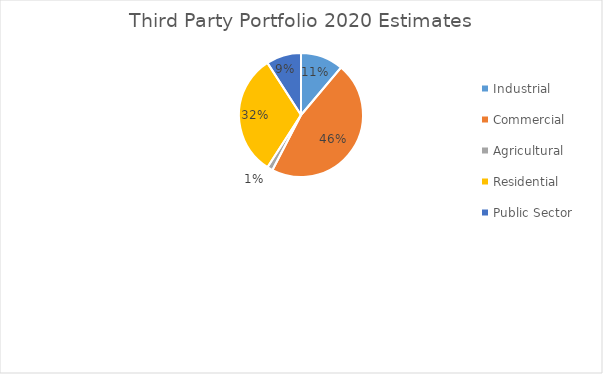
| Category | Series 0 |
|---|---|
| Industrial | 0.111 |
| Commercial | 0.465 |
| Agricultural | 0.015 |
| Residential | 0.318 |
| Public Sector | 0.091 |